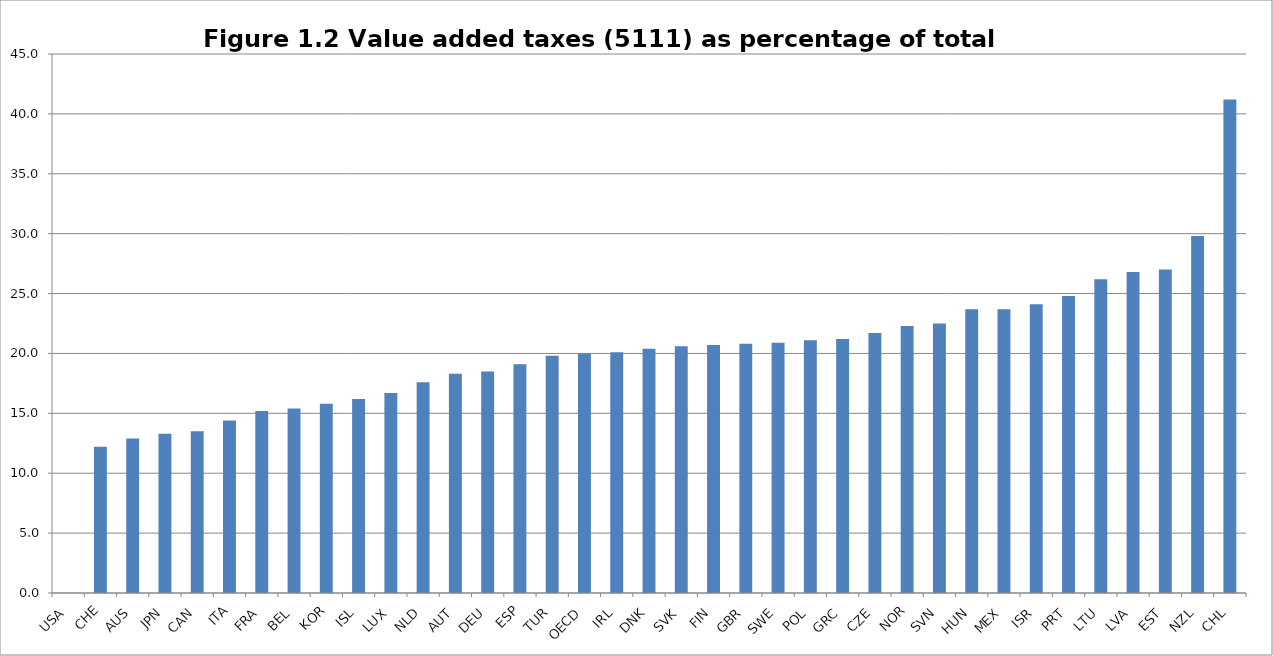
| Category | Series 0 |
|---|---|
| USA | 0 |
| CHE | 12.2 |
| AUS | 12.9 |
| JPN | 13.3 |
| CAN | 13.5 |
| ITA | 14.4 |
| FRA | 15.2 |
| BEL | 15.4 |
| KOR | 15.8 |
| ISL | 16.2 |
| LUX | 16.7 |
| NLD | 17.6 |
| AUT | 18.3 |
| DEU | 18.5 |
| ESP | 19.1 |
| TUR | 19.8 |
| OECD | 20 |
| IRL | 20.1 |
| DNK | 20.4 |
| SVK | 20.6 |
| FIN | 20.7 |
| GBR | 20.8 |
| SWE | 20.9 |
| POL | 21.1 |
| GRC | 21.2 |
| CZE | 21.7 |
| NOR | 22.3 |
| SVN | 22.5 |
| HUN | 23.7 |
| MEX | 23.7 |
| ISR | 24.1 |
| PRT | 24.8 |
| LTU | 26.2 |
| LVA | 26.8 |
| EST | 27 |
| NZL | 29.8 |
| CHL | 41.2 |